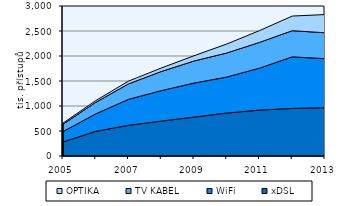
| Category | xDSL | WiFi | TV KABEL | OPTIKA |
|---|---|---|---|---|
| 2005.0 | 279.853 | 208.875 | 146.3 | 22.691 |
| 2006.0 | 493.402 | 350 | 229.78 | 35.495 |
| 2007.0 | 613.22 | 520 | 309 | 55 |
| 2008.0 | 697.2 | 609.9 | 382.5 | 70 |
| 2009.0 | 778.3 | 680 | 441.7 | 105 |
| 2010.0 | 859 | 720 | 481 | 180 |
| 2011.0 | 918 | 839 | 515 | 235.8 |
| 2012.1 | 951 | 1032 | 523 | 293 |
| 2013.0 | 965 | 982 | 518 | 364 |